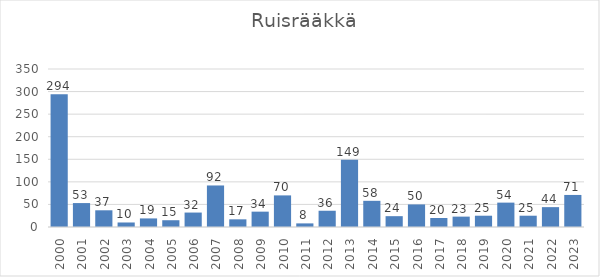
| Category | Series 0 |
|---|---|
| 2000.0 | 294 |
| 2001.0 | 53 |
| 2002.0 | 37 |
| 2003.0 | 10 |
| 2004.0 | 19 |
| 2005.0 | 15 |
| 2006.0 | 32 |
| 2007.0 | 92 |
| 2008.0 | 17 |
| 2009.0 | 34 |
| 2010.0 | 70 |
| 2011.0 | 8 |
| 2012.0 | 36 |
| 2013.0 | 149 |
| 2014.0 | 58 |
| 2015.0 | 24 |
| 2016.0 | 50 |
| 2017.0 | 20 |
| 2018.0 | 23 |
| 2019.0 | 25 |
| 2020.0 | 54 |
| 2021.0 | 25 |
| 2022.0 | 44 |
| 2023.0 | 71 |